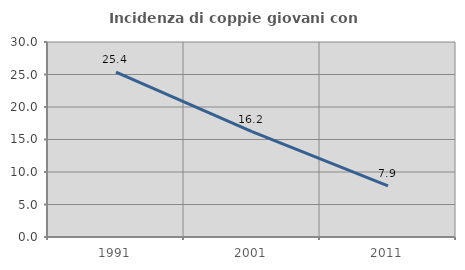
| Category | Incidenza di coppie giovani con figli |
|---|---|
| 1991.0 | 25.359 |
| 2001.0 | 16.223 |
| 2011.0 | 7.874 |